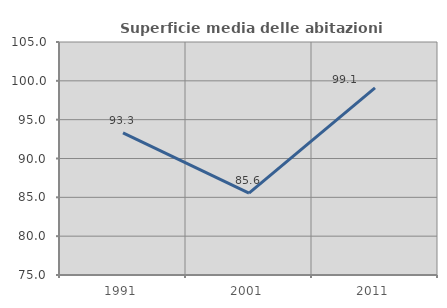
| Category | Superficie media delle abitazioni occupate |
|---|---|
| 1991.0 | 93.301 |
| 2001.0 | 85.554 |
| 2011.0 | 99.09 |